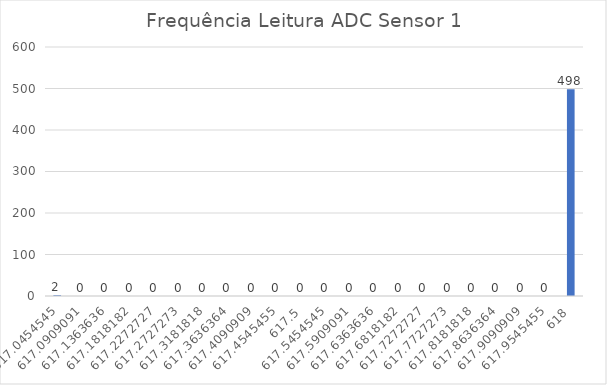
| Category | Series 0 |
|---|---|
| 617.0454545454545 | 2 |
| 617.0909090909091 | 0 |
| 617.1363636363636 | 0 |
| 617.1818181818181 | 0 |
| 617.2272727272727 | 0 |
| 617.2727272727273 | 0 |
| 617.3181818181819 | 0 |
| 617.3636363636364 | 0 |
| 617.4090909090909 | 0 |
| 617.4545454545455 | 0 |
| 617.5 | 0 |
| 617.5454545454545 | 0 |
| 617.5909090909091 | 0 |
| 617.6363636363636 | 0 |
| 617.6818181818181 | 0 |
| 617.7272727272727 | 0 |
| 617.7727272727273 | 0 |
| 617.8181818181819 | 0 |
| 617.8636363636364 | 0 |
| 617.9090909090909 | 0 |
| 617.9545454545455 | 0 |
| 618.0 | 498 |